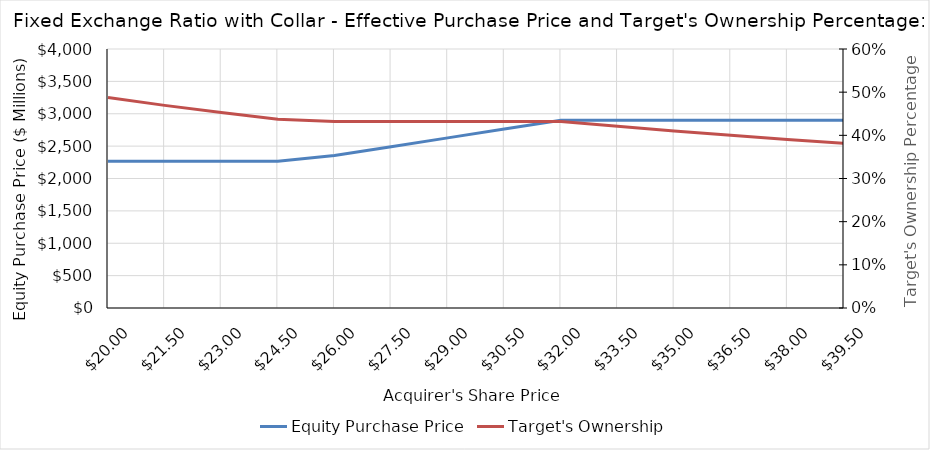
| Category | Equity Purchase Price |
|---|---|
| 20.0 | 2265.027 |
| 21.5 | 2265.027 |
| 23.0 | 2265.027 |
| 24.5 | 2265.027 |
| 26.0 | 2355.628 |
| 27.5 | 2491.529 |
| 29.0 | 2627.431 |
| 30.5 | 2763.333 |
| 32.0 | 2899.234 |
| 33.5 | 2899.234 |
| 35.0 | 2899.234 |
| 36.5 | 2899.234 |
| 38.0 | 2899.234 |
| 39.5 | 2899.234 |